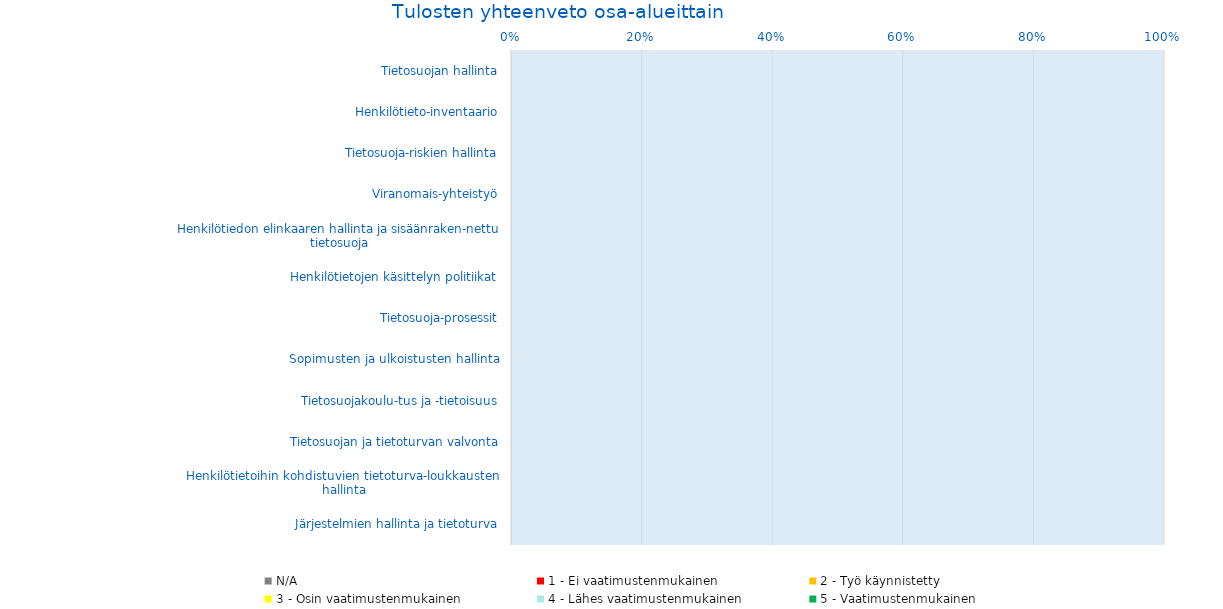
| Category | N/A | 1 - Ei vaatimustenmukainen | 2 - Työ käynnistetty | 3 - Osin vaatimustenmukainen | 4 - Lähes vaatimustenmukainen | 5 - Vaatimustenmukainen |
|---|---|---|---|---|---|---|
| Tietosuojan hallinta | 0 | 0 | 0 | 0 | 0 | 0 |
| Henkilötieto-inventaario | 0 | 0 | 0 | 0 | 0 | 0 |
| Tietosuoja-riskien hallinta | 0 | 0 | 0 | 0 | 0 | 0 |
| Viranomais-yhteistyö | 0 | 0 | 0 | 0 | 0 | 0 |
| Henkilötiedon elinkaaren hallinta ja sisäänraken-nettu tietosuoja | 0 | 0 | 0 | 0 | 0 | 0 |
| Henkilötietojen käsittelyn politiikat | 0 | 0 | 0 | 0 | 0 | 0 |
| Tietosuoja-prosessit | 0 | 0 | 0 | 0 | 0 | 0 |
| Sopimusten ja ulkoistusten hallinta | 0 | 0 | 0 | 0 | 0 | 0 |
| Tietosuojakoulu-tus ja -tietoisuus | 0 | 0 | 0 | 0 | 0 | 0 |
| Tietosuojan ja tietoturvan valvonta | 0 | 0 | 0 | 0 | 0 | 0 |
| Henkilötietoihin kohdistuvien tietoturva-loukkausten hallinta | 0 | 0 | 0 | 0 | 0 | 0 |
| Järjestelmien hallinta ja tietoturva | 0 | 0 | 0 | 0 | 0 | 0 |